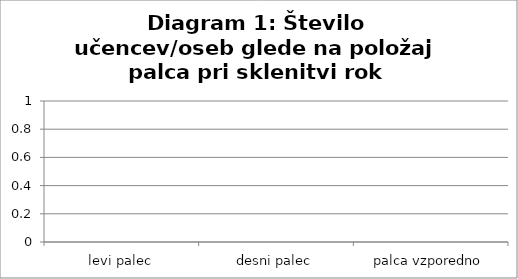
| Category | Skupaj |
|---|---|
| levi palec | 0 |
| desni palec | 0 |
| palca vzporedno | 0 |